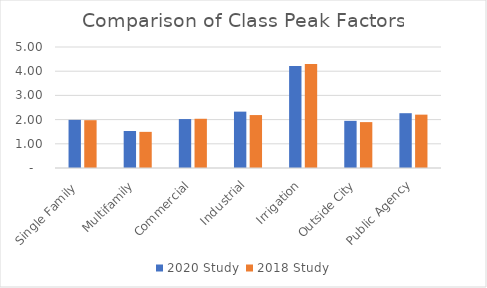
| Category | 2020 Study | 2018 Study |
|---|---|---|
| Single Family  | 1.989 | 1.975 |
| Multifamily | 1.528 | 1.493 |
| Commercial | 2.022 | 2.034 |
| Industrial | 2.329 | 2.188 |
| Irrigation | 4.213 | 4.294 |
| Outside City | 1.948 | 1.896 |
| Public Agency | 2.264 | 2.205 |